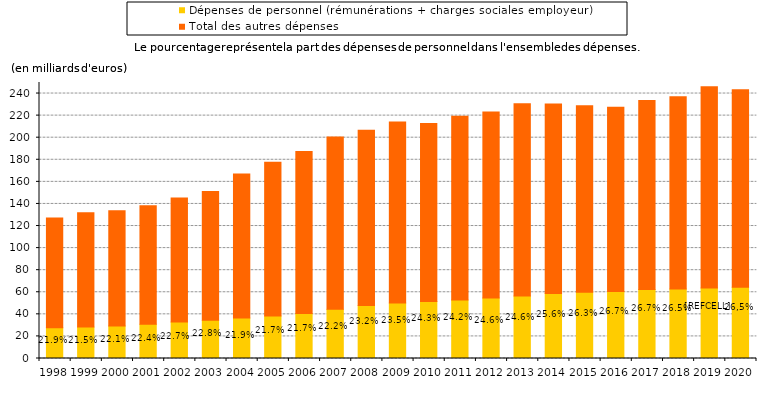
| Category | Dépenses de personnel (rémunérations + charges sociales employeur) | Total des autres dépenses |                                                  % |
|---|---|---|---|
| 1998.0 | 27.84 | 99.428 | 0.219 |
| 1999.0 | 28.43 | 103.617 | 0.215 |
| 2000.0 | 29.502 | 104.27 | 0.221 |
| 2001.0 | 30.977 | 107.475 | 0.224 |
| 2002.0 | 32.984 | 112.367 | 0.227 |
| 2003.0 | 34.543 | 116.645 | 0.228 |
| 2004.0 | 36.621 | 130.39 | 0.219 |
| 2005.0 | 38.569 | 139.218 | 0.217 |
| 2006.0 | 40.7 | 146.866 | 0.217 |
| 2007.0 | 44.509 | 156.081 | 0.222 |
| 2008.0 | 48.035 | 158.785 | 0.232 |
| 2009.0 | 50.3 | 163.93 | 0.235 |
| 2010.0 | 51.74 | 161.08 | 0.243 |
| 2011.0 | 52.998 | 166.387 | 0.242 |
| 2012.0 | 54.896 | 168.281 | 0.246 |
| 2013.0 | 56.628 | 174.036 | 0.246 |
| 2014.0 | 58.976 | 171.523 | 0.256 |
| 2015.0 | 60.119 | 168.863 | 0.263 |
| 2016.0 | 60.677 | 166.85 | 0.267 |
| 2017.0 | 62.41 | 171.347 | 0.267 |
| 2018.0 | 62.951 | 174.205 | 0.265 |
| 2019.0 | 63.923 | 182.175 | 0.26 |
| 2020.0 | 64.611 | 178.907 | 0.265 |